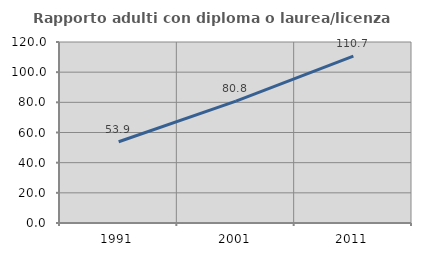
| Category | Rapporto adulti con diploma o laurea/licenza media  |
|---|---|
| 1991.0 | 53.86 |
| 2001.0 | 80.765 |
| 2011.0 | 110.662 |